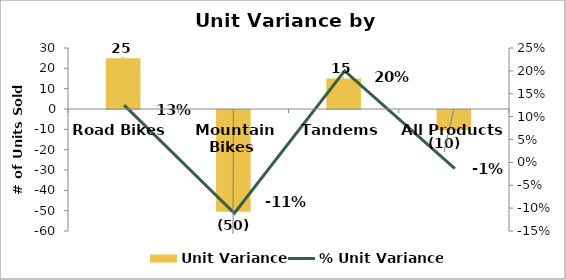
| Category | Unit Variance |
|---|---|
| Road Bikes  | 25 |
| Mountain Bikes  | -50 |
| Tandems  | 15 |
| All Products | -10 |